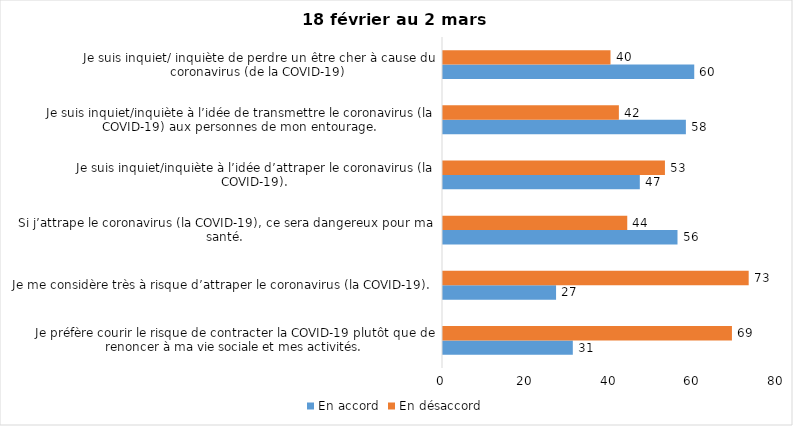
| Category | En accord | En désaccord |
|---|---|---|
| Je préfère courir le risque de contracter la COVID-19 plutôt que de renoncer à ma vie sociale et mes activités. | 31 | 69 |
| Je me considère très à risque d’attraper le coronavirus (la COVID-19). | 27 | 73 |
| Si j’attrape le coronavirus (la COVID-19), ce sera dangereux pour ma santé. | 56 | 44 |
| Je suis inquiet/inquiète à l’idée d’attraper le coronavirus (la COVID-19). | 47 | 53 |
| Je suis inquiet/inquiète à l’idée de transmettre le coronavirus (la COVID-19) aux personnes de mon entourage. | 58 | 42 |
| Je suis inquiet/ inquiète de perdre un être cher à cause du coronavirus (de la COVID-19) | 60 | 40 |